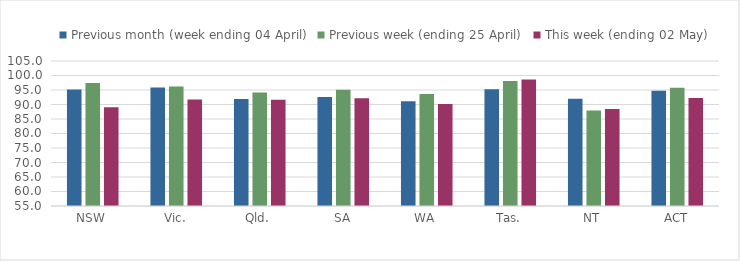
| Category | Previous month (week ending 04 April) | Previous week (ending 25 April) | This week (ending 02 May) |
|---|---|---|---|
| NSW | 95.163 | 97.415 | 89.056 |
| Vic. | 95.894 | 96.174 | 91.755 |
| Qld. | 91.922 | 94.144 | 91.654 |
| SA | 92.582 | 95.064 | 92.132 |
| WA | 91.129 | 93.615 | 90.159 |
| Tas. | 95.264 | 98.138 | 98.648 |
| NT | 91.955 | 87.915 | 88.441 |
| ACT | 94.736 | 95.786 | 92.255 |